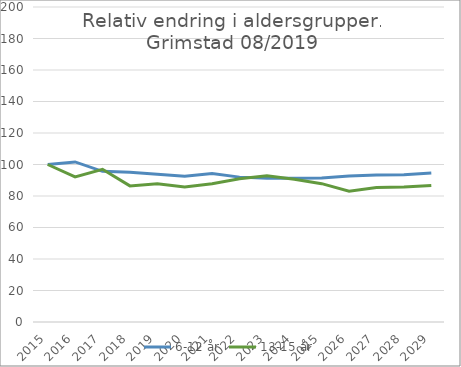
| Category | 6-12 år | 13-15 år |
|---|---|---|
| 2015.0 | 100 | 100 |
| 2016.0 | 101.631 | 92.156 |
| 2017.0 | 95.683 | 96.935 |
| 2018.0 | 95.046 | 86.421 |
| 2019.0 | 93.811 | 87.787 |
| 2020.0 | 92.592 | 85.696 |
| 2021.0 | 94.353 | 87.815 |
| 2022.0 | 91.982 | 91.005 |
| 2023.0 | 91.253 | 92.808 |
| 2024.0 | 91.333 | 90.602 |
| 2025.0 | 91.407 | 87.843 |
| 2026.0 | 92.701 | 83.03 |
| 2027.0 | 93.298 | 85.401 |
| 2028.0 | 93.429 | 85.687 |
| 2029.0 | 94.546 | 86.716 |